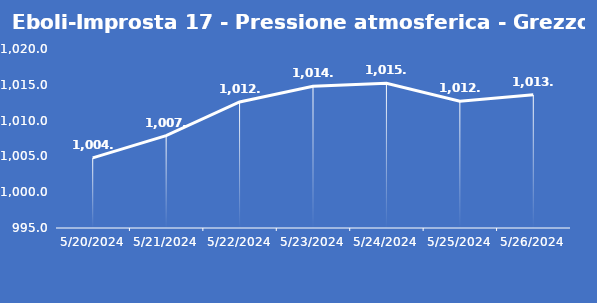
| Category | Eboli-Improsta 17 - Pressione atmosferica - Grezzo (hPa) |
|---|---|
| 5/20/24 | 1004.8 |
| 5/21/24 | 1007.9 |
| 5/22/24 | 1012.6 |
| 5/23/24 | 1014.8 |
| 5/24/24 | 1015.2 |
| 5/25/24 | 1012.7 |
| 5/26/24 | 1013.6 |